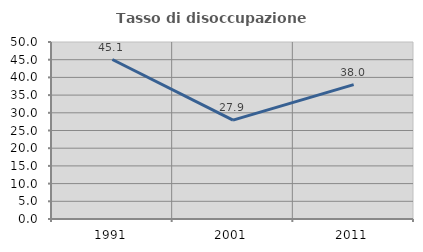
| Category | Tasso di disoccupazione giovanile  |
|---|---|
| 1991.0 | 45.055 |
| 2001.0 | 27.941 |
| 2011.0 | 37.975 |